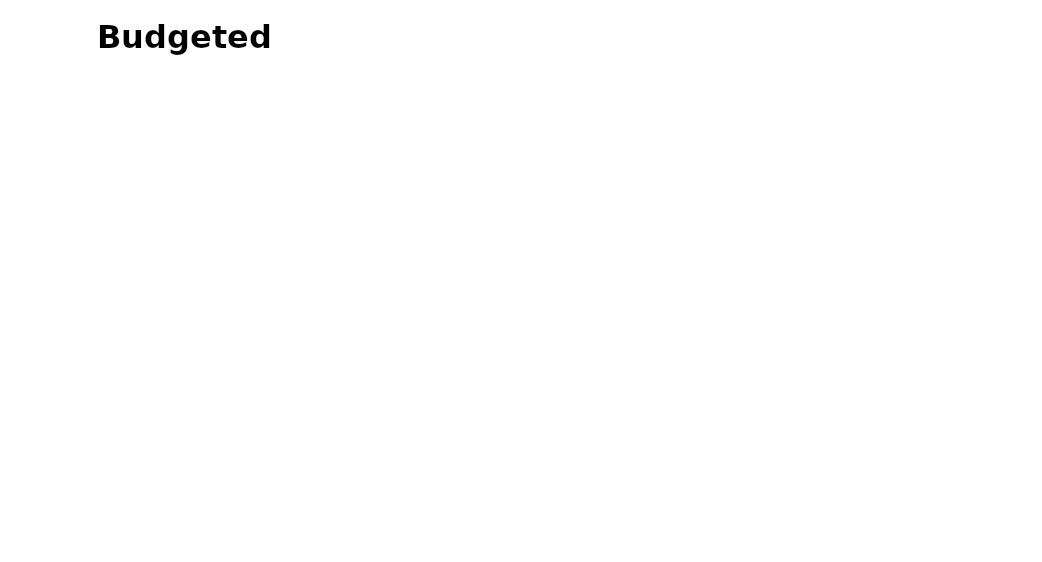
| Category | Expenses |
|---|---|
| Housing | 0 |
| Transportation | 0 |
| Medical | 0 |
| Utilities | 0 |
| Personal | 0 |
| Entertainment | 0 |
| Household Items | 0 |
| Giving | 0 |
| Pets | 0 |
| Insurance | 0 |
| Taxes | 0 |
| Debt Reduction | 0 |
| Education | 0 |
| Savings | 0 |